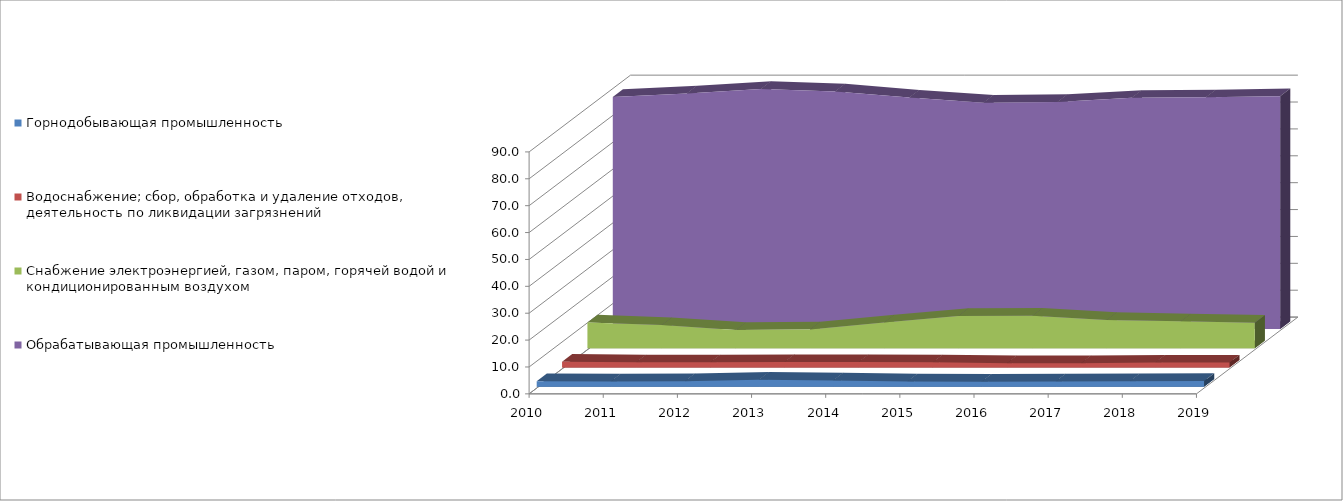
| Category | Горнодобывающая промышленность | Водоснабжение; сбор, обработка и удаление отходов, деятельность по ликвидации загрязнений | Снабжение электроэнергией, газом, паром, горячей водой и кондиционированным воздухом | Обрабатывающая промышленность |
|---|---|---|---|---|
| 0 | 2 | 2.1 | 9.6 | 86.3 |
| 1 | 1.9 | 1.9 | 8.6 | 87.6 |
| 2 | 2 | 1.9 | 6.8 | 89.3 |
| 3 | 2.6 | 2 | 7 | 88.4 |
| 4 | 2.3 | 2 | 9.6 | 86.1 |
| 5 | 1.9 | 1.9 | 12 | 84.2 |
| 6 | 1.8 | 1.6 | 12.1 | 84.5 |
| 7 | 1.9 | 1.6 | 10.5 | 86 |
| 8 | 2 | 1.8 | 10 | 86.2 |
| 9 | 2.1 | 1.8 | 9.5 | 86.6 |